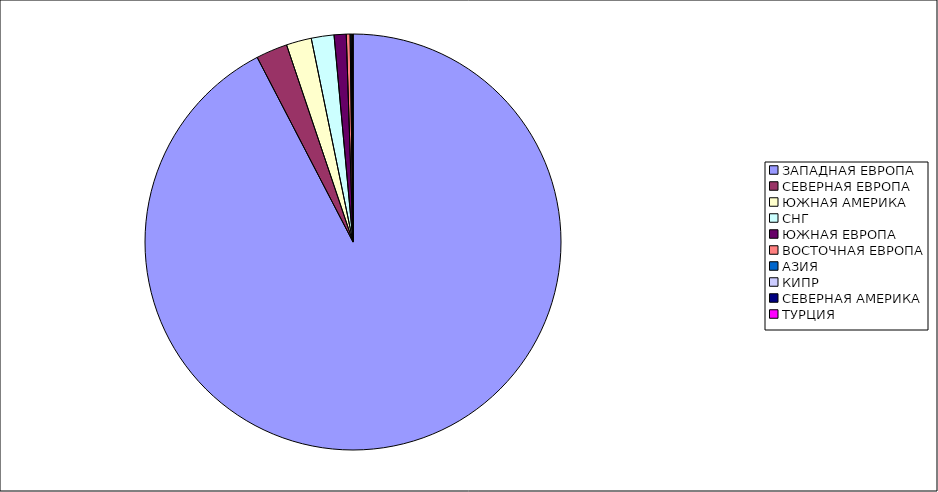
| Category | Оборот |
|---|---|
| ЗАПАДНАЯ ЕВРОПА | 0.924 |
| СЕВЕРНАЯ ЕВРОПА | 0.024 |
| ЮЖНАЯ АМЕРИКА | 0.02 |
| СНГ | 0.018 |
| ЮЖНАЯ ЕВРОПА | 0.009 |
| ВОСТОЧНАЯ ЕВРОПА | 0.003 |
| АЗИЯ | 0.001 |
| КИПР | 0.001 |
| СЕВЕРНАЯ АМЕРИКА | 0 |
| ТУРЦИЯ | 0 |